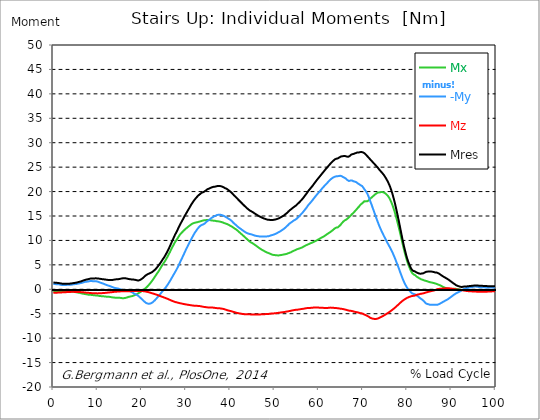
| Category |  Mx |  -My |  Mz |  Mres |
|---|---|---|---|---|
| 0.0 | -0.39 | 1.12 | -0.73 | 1.4 |
| 0.16678370786516855 | -0.39 | 1.08 | -0.73 | 1.37 |
| 0.3335674157303371 | -0.4 | 1.06 | -0.72 | 1.35 |
| 0.5003511235955057 | -0.4 | 1.05 | -0.71 | 1.34 |
| 0.6671348314606742 | -0.39 | 1.05 | -0.7 | 1.33 |
| 0.8339185393258427 | -0.4 | 1.03 | -0.69 | 1.31 |
| 1.0007022471910114 | -0.39 | 1.02 | -0.68 | 1.3 |
| 1.1674859550561796 | -0.37 | 1.01 | -0.67 | 1.28 |
| 1.3342696629213484 | -0.36 | 1 | -0.67 | 1.26 |
| 1.5010533707865168 | -0.35 | 0.97 | -0.66 | 1.24 |
| 1.6678370786516854 | -0.35 | 0.93 | -0.66 | 1.2 |
| 1.8346207865168538 | -0.36 | 0.89 | -0.65 | 1.17 |
| 2.001404494382023 | -0.37 | 0.87 | -0.63 | 1.15 |
| 2.1681882022471908 | -0.37 | 0.86 | -0.62 | 1.14 |
| 2.334971910112359 | -0.38 | 0.86 | -0.61 | 1.13 |
| 2.501755617977528 | -0.38 | 0.86 | -0.6 | 1.13 |
| 2.668539325842697 | -0.37 | 0.87 | -0.59 | 1.12 |
| 2.8353230337078656 | -0.35 | 0.88 | -0.58 | 1.12 |
| 3.0021067415730336 | -0.36 | 0.9 | -0.58 | 1.14 |
| 3.168890449438202 | -0.37 | 0.93 | -0.58 | 1.16 |
| 3.335674157303371 | -0.38 | 0.92 | -0.57 | 1.15 |
| 3.502457865168539 | -0.41 | 0.91 | -0.56 | 1.15 |
| 3.6692415730337076 | -0.43 | 0.9 | -0.55 | 1.15 |
| 3.8360252808988764 | -0.45 | 0.92 | -0.54 | 1.17 |
| 4.002808988764046 | -0.48 | 0.94 | -0.53 | 1.19 |
| 4.169592696629214 | -0.5 | 0.97 | -0.53 | 1.21 |
| 4.3363764044943816 | -0.51 | 0.99 | -0.52 | 1.23 |
| 4.50316011235955 | -0.52 | 1.01 | -0.52 | 1.26 |
| 4.669943820224718 | -0.53 | 1.04 | -0.53 | 1.28 |
| 4.836727528089888 | -0.55 | 1.05 | -0.54 | 1.31 |
| 5.003511235955056 | -0.57 | 1.07 | -0.54 | 1.33 |
| 5.170294943820225 | -0.6 | 1.09 | -0.54 | 1.36 |
| 5.337078651685394 | -0.64 | 1.11 | -0.54 | 1.39 |
| 5.5038623595505625 | -0.69 | 1.13 | -0.54 | 1.43 |
| 5.670646067415731 | -0.7 | 1.17 | -0.54 | 1.48 |
| 5.837429775280899 | -0.72 | 1.21 | -0.55 | 1.51 |
| 6.004213483146067 | -0.75 | 1.24 | -0.57 | 1.55 |
| 6.170997191011236 | -0.78 | 1.26 | -0.58 | 1.59 |
| 6.329002808988764 | -0.82 | 1.29 | -0.59 | 1.64 |
| 6.495786516853932 | -0.87 | 1.33 | -0.6 | 1.7 |
| 6.662570224719101 | -0.9 | 1.38 | -0.61 | 1.76 |
| 6.82935393258427 | -0.93 | 1.43 | -0.62 | 1.82 |
| 6.9961376404494375 | -0.95 | 1.48 | -0.64 | 1.87 |
| 7.162921348314607 | -0.98 | 1.52 | -0.66 | 1.93 |
| 7.329705056179775 | -1 | 1.54 | -0.68 | 1.96 |
| 7.496488764044945 | -1.03 | 1.56 | -0.7 | 1.99 |
| 7.663272471910113 | -1.06 | 1.57 | -0.71 | 2.02 |
| 7.830056179775281 | -1.09 | 1.59 | -0.72 | 2.06 |
| 7.996839887640449 | -1.12 | 1.62 | -0.73 | 2.1 |
| 8.16362359550562 | -1.13 | 1.65 | -0.75 | 2.14 |
| 8.330407303370787 | -1.13 | 1.7 | -0.77 | 2.18 |
| 8.497191011235955 | -1.14 | 1.71 | -0.78 | 2.2 |
| 8.663974719101123 | -1.16 | 1.69 | -0.79 | 2.2 |
| 8.830758426966291 | -1.17 | 1.67 | -0.8 | 2.19 |
| 8.99754213483146 | -1.2 | 1.65 | -0.81 | 2.2 |
| 9.16432584269663 | -1.23 | 1.66 | -0.82 | 2.22 |
| 9.331109550561798 | -1.24 | 1.66 | -0.83 | 2.23 |
| 9.497893258426966 | -1.25 | 1.66 | -0.83 | 2.24 |
| 9.664676966292134 | -1.26 | 1.65 | -0.83 | 2.24 |
| 9.831460674157304 | -1.27 | 1.61 | -0.84 | 2.22 |
| 9.998244382022472 | -1.29 | 1.57 | -0.84 | 2.21 |
| 10.16502808988764 | -1.31 | 1.52 | -0.84 | 2.19 |
| 10.331811797752808 | -1.35 | 1.46 | -0.83 | 2.18 |
| 10.498595505617978 | -1.38 | 1.41 | -0.83 | 2.16 |
| 10.665379213483147 | -1.39 | 1.35 | -0.82 | 2.13 |
| 10.832162921348315 | -1.41 | 1.29 | -0.8 | 2.1 |
| 10.998946629213483 | -1.42 | 1.24 | -0.79 | 2.08 |
| 11.165730337078653 | -1.43 | 1.19 | -0.77 | 2.06 |
| 11.33251404494382 | -1.44 | 1.14 | -0.76 | 2.05 |
| 11.49929775280899 | -1.45 | 1.08 | -0.75 | 2.03 |
| 11.666081460674157 | -1.47 | 1.01 | -0.74 | 2 |
| 11.832865168539326 | -1.49 | 0.95 | -0.73 | 1.98 |
| 11.999648876404493 | -1.51 | 0.89 | -0.71 | 1.96 |
| 12.166432584269662 | -1.53 | 0.84 | -0.69 | 1.94 |
| 12.333216292134832 | -1.54 | 0.78 | -0.67 | 1.92 |
| 12.5 | -1.54 | 0.73 | -0.65 | 1.9 |
| 12.66678370786517 | -1.55 | 0.69 | -0.64 | 1.89 |
| 12.833567415730336 | -1.57 | 0.64 | -0.62 | 1.89 |
| 13.000351123595506 | -1.6 | 0.58 | -0.61 | 1.9 |
| 13.167134831460674 | -1.63 | 0.51 | -0.6 | 1.9 |
| 13.333918539325843 | -1.65 | 0.45 | -0.58 | 1.91 |
| 13.500702247191011 | -1.67 | 0.39 | -0.56 | 1.92 |
| 13.667485955056181 | -1.69 | 0.33 | -0.53 | 1.96 |
| 13.834269662921349 | -1.71 | 0.29 | -0.52 | 2 |
| 14.001053370786519 | -1.72 | 0.25 | -0.5 | 2.02 |
| 14.167837078651687 | -1.72 | 0.21 | -0.49 | 2.03 |
| 14.334620786516853 | -1.73 | 0.2 | -0.48 | 2.05 |
| 14.501404494382026 | -1.73 | 0.18 | -0.48 | 2.06 |
| 14.668188202247192 | -1.73 | 0.14 | -0.47 | 2.06 |
| 14.834971910112362 | -1.73 | 0.08 | -0.45 | 2.09 |
| 15.001755617977528 | -1.74 | 0.03 | -0.44 | 2.12 |
| 15.168539325842698 | -1.76 | -0.02 | -0.43 | 2.15 |
| 15.335323033707864 | -1.79 | -0.06 | -0.42 | 2.19 |
| 15.502106741573034 | -1.81 | -0.1 | -0.4 | 2.22 |
| 15.6688904494382 | -1.83 | -0.14 | -0.39 | 2.24 |
| 15.83567415730337 | -1.82 | -0.15 | -0.39 | 2.24 |
| 16.00245786516854 | -1.81 | -0.15 | -0.38 | 2.25 |
| 16.16924157303371 | -1.8 | -0.15 | -0.38 | 2.26 |
| 16.336025280898877 | -1.76 | -0.16 | -0.39 | 2.24 |
| 16.502808988764045 | -1.72 | -0.17 | -0.39 | 2.21 |
| 16.669592696629216 | -1.67 | -0.19 | -0.39 | 2.18 |
| 16.83637640449438 | -1.61 | -0.21 | -0.4 | 2.14 |
| 17.003160112359552 | -1.56 | -0.24 | -0.4 | 2.11 |
| 17.169943820224717 | -1.52 | -0.3 | -0.4 | 2.08 |
| 17.336727528089888 | -1.49 | -0.38 | -0.39 | 2.05 |
| 17.503511235955056 | -1.47 | -0.47 | -0.38 | 2.04 |
| 17.670294943820224 | -1.43 | -0.55 | -0.38 | 2.02 |
| 17.837078651685395 | -1.39 | -0.63 | -0.37 | 2.01 |
| 18.003862359550563 | -1.35 | -0.72 | -0.36 | 2 |
| 18.17064606741573 | -1.29 | -0.83 | -0.35 | 1.98 |
| 18.3374297752809 | -1.22 | -0.93 | -0.34 | 1.96 |
| 18.504213483146067 | -1.15 | -1.01 | -0.34 | 1.96 |
| 18.662219101123597 | -1.09 | -1.05 | -0.34 | 1.9 |
| 18.829002808988765 | -1.02 | -1.12 | -0.34 | 1.84 |
| 18.995786516853933 | -0.94 | -1.21 | -0.34 | 1.82 |
| 19.1625702247191 | -0.84 | -1.32 | -0.33 | 1.8 |
| 19.32935393258427 | -0.75 | -1.45 | -0.33 | 1.82 |
| 19.49613764044944 | -0.67 | -1.61 | -0.33 | 1.88 |
| 19.662921348314608 | -0.57 | -1.73 | -0.33 | 1.94 |
| 19.829705056179776 | -0.47 | -1.88 | -0.34 | 2.04 |
| 19.996488764044944 | -0.37 | -2.01 | -0.35 | 2.13 |
| 20.163272471910112 | -0.27 | -2.14 | -0.36 | 2.23 |
| 20.33005617977528 | -0.16 | -2.3 | -0.38 | 2.37 |
| 20.49683988764045 | -0.04 | -2.44 | -0.4 | 2.51 |
| 20.663623595505616 | 0.09 | -2.58 | -0.43 | 2.66 |
| 20.830407303370787 | 0.21 | -2.71 | -0.45 | 2.79 |
| 20.997191011235955 | 0.34 | -2.82 | -0.48 | 2.92 |
| 21.163974719101123 | 0.49 | -2.88 | -0.52 | 3 |
| 21.330758426966295 | 0.64 | -2.93 | -0.55 | 3.09 |
| 21.497542134831463 | 0.8 | -2.96 | -0.59 | 3.16 |
| 21.66432584269663 | 0.98 | -2.96 | -0.63 | 3.23 |
| 21.8311095505618 | 1.17 | -2.93 | -0.67 | 3.3 |
| 21.997893258426966 | 1.35 | -2.89 | -0.72 | 3.36 |
| 22.164676966292134 | 1.54 | -2.84 | -0.77 | 3.43 |
| 22.331460674157306 | 1.74 | -2.74 | -0.82 | 3.53 |
| 22.498244382022467 | 1.96 | -2.61 | -0.87 | 3.64 |
| 22.66502808988764 | 2.18 | -2.49 | -0.91 | 3.76 |
| 22.831811797752806 | 2.41 | -2.35 | -0.96 | 3.89 |
| 22.99859550561798 | 2.63 | -2.2 | -1.01 | 4.03 |
| 23.165379213483146 | 2.86 | -2.04 | -1.06 | 4.18 |
| 23.332162921348313 | 3.09 | -1.86 | -1.11 | 4.35 |
| 23.49894662921348 | 3.3 | -1.69 | -1.16 | 4.54 |
| 23.665730337078653 | 3.5 | -1.5 | -1.21 | 4.74 |
| 23.83251404494382 | 3.74 | -1.31 | -1.27 | 4.95 |
| 23.999297752808985 | 3.99 | -1.15 | -1.33 | 5.13 |
| 24.166081460674157 | 4.25 | -0.98 | -1.39 | 5.33 |
| 24.332865168539325 | 4.5 | -0.79 | -1.45 | 5.56 |
| 24.499648876404496 | 4.75 | -0.59 | -1.5 | 5.79 |
| 24.666432584269664 | 5 | -0.39 | -1.56 | 6.04 |
| 24.833216292134832 | 5.22 | -0.23 | -1.61 | 6.26 |
| 25.0 | 5.42 | -0.09 | -1.67 | 6.47 |
| 25.16678370786517 | 5.66 | 0.09 | -1.72 | 6.72 |
| 25.33356741573034 | 5.91 | 0.29 | -1.78 | 6.99 |
| 25.500351123595504 | 6.17 | 0.49 | -1.84 | 7.26 |
| 25.66713483146067 | 6.44 | 0.71 | -1.9 | 7.54 |
| 25.833918539325843 | 6.71 | 0.93 | -1.96 | 7.84 |
| 26.00070224719101 | 7 | 1.16 | -2.03 | 8.14 |
| 26.16748595505618 | 7.29 | 1.4 | -2.09 | 8.45 |
| 26.334269662921347 | 7.58 | 1.65 | -2.16 | 8.77 |
| 26.50105337078652 | 7.89 | 1.9 | -2.23 | 9.11 |
| 26.667837078651687 | 8.2 | 2.17 | -2.3 | 9.45 |
| 26.834620786516858 | 8.51 | 2.42 | -2.37 | 9.79 |
| 27.001404494382022 | 8.79 | 2.69 | -2.42 | 10.13 |
| 27.16818820224719 | 9.08 | 2.96 | -2.48 | 10.47 |
| 27.334971910112362 | 9.36 | 3.22 | -2.54 | 10.81 |
| 27.50175561797753 | 9.64 | 3.48 | -2.59 | 11.14 |
| 27.668539325842698 | 9.87 | 3.75 | -2.63 | 11.43 |
| 27.835323033707866 | 10.08 | 4.01 | -2.66 | 11.71 |
| 28.002106741573037 | 10.31 | 4.31 | -2.7 | 12.02 |
| 28.168890449438205 | 10.55 | 4.6 | -2.74 | 12.34 |
| 28.335674157303373 | 10.79 | 4.9 | -2.79 | 12.67 |
| 28.502457865168537 | 11.02 | 5.24 | -2.82 | 12.99 |
| 28.669241573033705 | 11.23 | 5.57 | -2.86 | 13.28 |
| 28.836025280898877 | 11.4 | 5.89 | -2.89 | 13.55 |
| 29.002808988764052 | 11.57 | 6.2 | -2.92 | 13.84 |
| 29.169592696629213 | 11.73 | 6.52 | -2.95 | 14.11 |
| 29.336376404494384 | 11.88 | 6.85 | -2.98 | 14.39 |
| 29.50316011235955 | 12.04 | 7.17 | -3.01 | 14.7 |
| 29.669943820224724 | 12.18 | 7.5 | -3.05 | 14.98 |
| 29.836727528089884 | 12.31 | 7.83 | -3.08 | 15.23 |
| 30.003511235955056 | 12.44 | 8.15 | -3.1 | 15.49 |
| 30.170294943820224 | 12.57 | 8.45 | -3.13 | 15.75 |
| 30.337078651685395 | 12.69 | 8.74 | -3.16 | 16.02 |
| 30.503862359550563 | 12.82 | 9.05 | -3.18 | 16.27 |
| 30.670646067415728 | 12.94 | 9.35 | -3.2 | 16.52 |
| 30.837429775280903 | 13.06 | 9.66 | -3.23 | 16.79 |
| 30.99543539325843 | 13.17 | 9.95 | -3.25 | 17.05 |
| 31.162219101123597 | 13.28 | 10.25 | -3.28 | 17.32 |
| 31.32900280898876 | 13.38 | 10.53 | -3.3 | 17.56 |
| 31.495786516853936 | 13.46 | 10.79 | -3.32 | 17.78 |
| 31.6625702247191 | 13.53 | 11.07 | -3.34 | 18.01 |
| 31.82935393258427 | 13.58 | 11.35 | -3.36 | 18.22 |
| 31.996137640449433 | 13.62 | 11.6 | -3.37 | 18.42 |
| 32.162921348314605 | 13.66 | 11.8 | -3.37 | 18.59 |
| 32.329705056179776 | 13.69 | 12.02 | -3.38 | 18.76 |
| 32.49648876404494 | 13.72 | 12.25 | -3.39 | 18.94 |
| 32.66327247191011 | 13.76 | 12.46 | -3.4 | 19.1 |
| 32.83005617977528 | 13.81 | 12.62 | -3.42 | 19.25 |
| 32.996839887640455 | 13.85 | 12.8 | -3.43 | 19.38 |
| 33.16362359550562 | 13.88 | 12.93 | -3.45 | 19.49 |
| 33.330407303370784 | 13.93 | 13.07 | -3.47 | 19.62 |
| 33.497191011235955 | 13.99 | 13.19 | -3.5 | 19.75 |
| 33.66397471910113 | 14.03 | 13.21 | -3.54 | 19.8 |
| 33.83075842696629 | 14.08 | 13.24 | -3.58 | 19.86 |
| 33.997542134831455 | 14.11 | 13.33 | -3.6 | 19.96 |
| 34.164325842696634 | 14.11 | 13.42 | -3.62 | 20.02 |
| 34.3311095505618 | 14.14 | 13.55 | -3.64 | 20.12 |
| 34.49789325842697 | 14.17 | 13.69 | -3.66 | 20.24 |
| 34.66467696629213 | 14.18 | 13.85 | -3.68 | 20.36 |
| 34.831460674157306 | 14.17 | 14.02 | -3.69 | 20.47 |
| 34.99824438202247 | 14.17 | 14.07 | -3.72 | 20.51 |
| 35.16502808988764 | 14.17 | 14.2 | -3.73 | 20.6 |
| 35.331811797752806 | 14.16 | 14.28 | -3.74 | 20.65 |
| 35.49859550561798 | 14.13 | 14.44 | -3.72 | 20.74 |
| 35.66537921348315 | 14.11 | 14.56 | -3.72 | 20.81 |
| 35.83216292134831 | 14.08 | 14.67 | -3.73 | 20.87 |
| 35.998946629213485 | 14.07 | 14.73 | -3.74 | 20.9 |
| 36.16573033707865 | 14.04 | 14.88 | -3.75 | 20.96 |
| 36.33251404494382 | 14.02 | 14.93 | -3.78 | 20.98 |
| 36.499297752808985 | 14.01 | 14.98 | -3.81 | 21 |
| 36.666081460674164 | 14 | 15.04 | -3.83 | 21.03 |
| 36.83286516853932 | 13.97 | 15.11 | -3.84 | 21.07 |
| 36.99964887640449 | 13.92 | 15.2 | -3.86 | 21.11 |
| 37.166432584269664 | 13.92 | 15.24 | -3.87 | 21.14 |
| 37.333216292134836 | 13.9 | 15.26 | -3.89 | 21.15 |
| 37.5 | 13.87 | 15.26 | -3.89 | 21.14 |
| 37.666783707865164 | 13.84 | 15.27 | -3.9 | 21.14 |
| 37.833567415730336 | 13.81 | 15.24 | -3.92 | 21.11 |
| 38.00035112359551 | 13.77 | 15.21 | -3.95 | 21.07 |
| 38.16713483146068 | 13.73 | 15.15 | -3.97 | 21.01 |
| 38.333918539325836 | 13.67 | 15.1 | -4 | 20.95 |
| 38.50070224719101 | 13.6 | 15.05 | -4.04 | 20.88 |
| 38.66748595505618 | 13.54 | 14.96 | -4.08 | 20.79 |
| 38.83426966292135 | 13.48 | 14.88 | -4.13 | 20.7 |
| 39.001053370786515 | 13.44 | 14.79 | -4.18 | 20.63 |
| 39.16783707865169 | 13.4 | 14.71 | -4.23 | 20.57 |
| 39.33462078651686 | 13.33 | 14.61 | -4.29 | 20.46 |
| 39.50140449438202 | 13.26 | 14.51 | -4.33 | 20.35 |
| 39.668188202247194 | 13.18 | 14.41 | -4.36 | 20.24 |
| 39.83497191011236 | 13.09 | 14.32 | -4.4 | 20.12 |
| 40.00175561797753 | 13 | 14.23 | -4.44 | 20.01 |
| 40.168539325842694 | 12.91 | 14.12 | -4.47 | 19.88 |
| 40.335323033707866 | 12.84 | 13.97 | -4.52 | 19.74 |
| 40.50210674157304 | 12.75 | 13.81 | -4.57 | 19.58 |
| 40.6688904494382 | 12.64 | 13.65 | -4.61 | 19.41 |
| 40.83567415730337 | 12.53 | 13.49 | -4.65 | 19.23 |
| 41.00245786516854 | 12.43 | 13.36 | -4.7 | 19.09 |
| 41.16924157303371 | 12.35 | 13.25 | -4.74 | 18.97 |
| 41.33602528089887 | 12.25 | 13.12 | -4.79 | 18.82 |
| 41.502808988764045 | 12.12 | 12.99 | -4.83 | 18.66 |
| 41.669592696629216 | 11.99 | 12.83 | -4.86 | 18.48 |
| 41.83637640449439 | 11.86 | 12.7 | -4.9 | 18.32 |
| 42.00316011235955 | 11.72 | 12.59 | -4.93 | 18.17 |
| 42.16994382022472 | 11.59 | 12.49 | -4.95 | 18.02 |
| 42.33672752808989 | 11.45 | 12.39 | -4.98 | 17.87 |
| 42.50351123595506 | 11.32 | 12.27 | -5.01 | 17.72 |
| 42.670294943820224 | 11.19 | 12.15 | -5.03 | 17.57 |
| 42.83707865168539 | 11.07 | 12.01 | -5.06 | 17.41 |
| 43.00386235955057 | 10.92 | 11.94 | -5.08 | 17.27 |
| 43.17064606741573 | 10.78 | 11.83 | -5.09 | 17.12 |
| 43.32865168539326 | 10.65 | 11.73 | -5.1 | 16.97 |
| 43.495435393258425 | 10.51 | 11.65 | -5.11 | 16.83 |
| 43.6622191011236 | 10.37 | 11.55 | -5.12 | 16.68 |
| 43.82900280898876 | 10.23 | 11.49 | -5.12 | 16.55 |
| 43.99578651685393 | 10.09 | 11.43 | -5.13 | 16.43 |
| 44.162570224719104 | 9.96 | 11.38 | -5.13 | 16.3 |
| 44.32935393258427 | 9.82 | 11.33 | -5.13 | 16.19 |
| 44.49613764044944 | 9.7 | 11.29 | -5.14 | 16.08 |
| 44.66292134831461 | 9.59 | 11.27 | -5.14 | 16 |
| 44.82970505617978 | 9.53 | 11.21 | -5.15 | 15.92 |
| 44.99648876404493 | 9.45 | 11.17 | -5.15 | 15.84 |
| 45.16327247191011 | 9.35 | 11.11 | -5.15 | 15.74 |
| 45.33005617977528 | 9.24 | 11.06 | -5.16 | 15.63 |
| 45.49683988764045 | 9.14 | 11 | -5.16 | 15.53 |
| 45.66362359550561 | 9.03 | 10.96 | -5.17 | 15.43 |
| 45.83040730337079 | 8.92 | 10.92 | -5.17 | 15.34 |
| 45.99719101123596 | 8.81 | 10.9 | -5.17 | 15.25 |
| 46.16397471910113 | 8.69 | 10.87 | -5.17 | 15.15 |
| 46.33075842696629 | 8.58 | 10.86 | -5.16 | 15.06 |
| 46.497542134831455 | 8.48 | 10.83 | -5.16 | 14.97 |
| 46.66432584269663 | 8.37 | 10.81 | -5.15 | 14.89 |
| 46.83110955056179 | 8.27 | 10.8 | -5.14 | 14.82 |
| 46.99789325842696 | 8.17 | 10.81 | -5.13 | 14.74 |
| 47.164676966292134 | 8.08 | 10.8 | -5.12 | 14.67 |
| 47.331460674157306 | 7.99 | 10.8 | -5.11 | 14.6 |
| 47.49824438202247 | 7.91 | 10.8 | -5.11 | 14.54 |
| 47.66502808988764 | 7.83 | 10.8 | -5.1 | 14.48 |
| 47.83181179775281 | 7.76 | 10.8 | -5.09 | 14.42 |
| 47.99859550561797 | 7.67 | 10.81 | -5.08 | 14.37 |
| 48.16537921348314 | 7.59 | 10.83 | -5.07 | 14.32 |
| 48.33216292134831 | 7.52 | 10.83 | -5.06 | 14.28 |
| 48.498946629213485 | 7.46 | 10.83 | -5.05 | 14.23 |
| 48.66573033707865 | 7.4 | 10.86 | -5.04 | 14.21 |
| 48.83251404494382 | 7.35 | 10.9 | -5.02 | 14.21 |
| 48.99929775280899 | 7.28 | 10.97 | -4.99 | 14.21 |
| 49.166081460674164 | 7.22 | 11.01 | -4.98 | 14.19 |
| 49.33286516853933 | 7.13 | 11.07 | -4.97 | 14.18 |
| 49.499648876404486 | 7.07 | 11.1 | -4.96 | 14.17 |
| 49.666432584269664 | 7.05 | 11.15 | -4.95 | 14.19 |
| 49.83321629213483 | 7.02 | 11.21 | -4.94 | 14.22 |
| 50.0 | 7 | 11.26 | -4.92 | 14.25 |
| 50.166783707865164 | 6.99 | 11.32 | -4.91 | 14.28 |
| 50.33356741573034 | 6.98 | 11.38 | -4.89 | 14.31 |
| 50.50035112359551 | 6.96 | 11.46 | -4.88 | 14.36 |
| 50.66713483146068 | 6.94 | 11.55 | -4.85 | 14.42 |
| 50.83391853932584 | 6.94 | 11.63 | -4.83 | 14.47 |
| 51.00070224719101 | 6.94 | 11.72 | -4.8 | 14.54 |
| 51.16748595505618 | 6.96 | 11.8 | -4.78 | 14.61 |
| 51.33426966292134 | 6.99 | 11.88 | -4.76 | 14.68 |
| 51.50105337078652 | 7.02 | 11.99 | -4.74 | 14.78 |
| 51.66783707865169 | 7.04 | 12.09 | -4.72 | 14.87 |
| 51.83462078651686 | 7.06 | 12.2 | -4.7 | 14.96 |
| 52.00140449438202 | 7.1 | 12.29 | -4.68 | 15.04 |
| 52.168188202247194 | 7.13 | 12.38 | -4.65 | 15.13 |
| 52.33497191011236 | 7.16 | 12.53 | -4.63 | 15.26 |
| 52.50175561797752 | 7.18 | 12.69 | -4.6 | 15.39 |
| 52.668539325842694 | 7.22 | 12.81 | -4.57 | 15.51 |
| 52.835323033707866 | 7.28 | 12.92 | -4.55 | 15.63 |
| 53.00210674157304 | 7.34 | 13.08 | -4.52 | 15.78 |
| 53.1688904494382 | 7.39 | 13.25 | -4.49 | 15.94 |
| 53.33567415730337 | 7.45 | 13.4 | -4.46 | 16.08 |
| 53.502457865168545 | 7.5 | 13.52 | -4.44 | 16.21 |
| 53.669241573033716 | 7.56 | 13.63 | -4.41 | 16.33 |
| 53.83602528089887 | 7.64 | 13.72 | -4.38 | 16.44 |
| 54.002808988764045 | 7.72 | 13.83 | -4.33 | 16.56 |
| 54.169592696629216 | 7.8 | 13.95 | -4.28 | 16.69 |
| 54.33637640449438 | 7.87 | 14.07 | -4.27 | 16.82 |
| 54.50316011235955 | 7.93 | 14.15 | -4.24 | 16.92 |
| 54.669943820224724 | 8.01 | 14.22 | -4.22 | 17.01 |
| 54.836727528089895 | 8.08 | 14.32 | -4.2 | 17.13 |
| 55.00351123595506 | 8.16 | 14.43 | -4.19 | 17.26 |
| 55.17029494382022 | 8.22 | 14.59 | -4.18 | 17.43 |
| 55.337078651685395 | 8.27 | 14.73 | -4.16 | 17.57 |
| 55.50386235955056 | 8.32 | 14.87 | -4.14 | 17.7 |
| 55.66186797752809 | 8.36 | 15.02 | -4.11 | 17.85 |
| 55.82865168539326 | 8.41 | 15.19 | -4.08 | 18.01 |
| 55.995435393258425 | 8.47 | 15.36 | -4.05 | 18.17 |
| 56.1622191011236 | 8.54 | 15.52 | -4.03 | 18.34 |
| 56.32900280898877 | 8.61 | 15.67 | -4.01 | 18.5 |
| 56.49578651685393 | 8.7 | 15.86 | -3.99 | 18.69 |
| 56.6625702247191 | 8.78 | 16.05 | -3.97 | 18.9 |
| 56.82935393258427 | 8.86 | 16.24 | -3.94 | 19.1 |
| 56.99613764044943 | 8.95 | 16.43 | -3.9 | 19.3 |
| 57.16292134831461 | 9.03 | 16.62 | -3.88 | 19.5 |
| 57.329705056179776 | 9.09 | 16.82 | -3.85 | 19.7 |
| 57.49648876404495 | 9.16 | 17.05 | -3.84 | 19.93 |
| 57.66327247191011 | 9.22 | 17.26 | -3.83 | 20.15 |
| 57.83005617977529 | 9.28 | 17.43 | -3.83 | 20.32 |
| 57.99683988764044 | 9.36 | 17.6 | -3.82 | 20.51 |
| 58.16362359550561 | 9.42 | 17.78 | -3.81 | 20.69 |
| 58.33040730337079 | 9.49 | 17.95 | -3.79 | 20.87 |
| 58.497191011235955 | 9.55 | 18.13 | -3.78 | 21.06 |
| 58.66397471910112 | 9.61 | 18.32 | -3.76 | 21.25 |
| 58.83075842696629 | 9.68 | 18.53 | -3.74 | 21.46 |
| 58.99754213483147 | 9.75 | 18.72 | -3.73 | 21.66 |
| 59.164325842696634 | 9.82 | 18.91 | -3.72 | 21.86 |
| 59.33110955056179 | 9.9 | 19.11 | -3.72 | 22.07 |
| 59.49789325842697 | 9.99 | 19.28 | -3.73 | 22.25 |
| 59.664676966292134 | 10.07 | 19.48 | -3.73 | 22.47 |
| 59.8314606741573 | 10.16 | 19.65 | -3.74 | 22.65 |
| 59.99824438202247 | 10.24 | 19.81 | -3.75 | 22.83 |
| 60.16502808988765 | 10.33 | 19.98 | -3.77 | 23.01 |
| 60.33181179775281 | 10.42 | 20.16 | -3.78 | 23.2 |
| 60.49859550561798 | 10.51 | 20.34 | -3.79 | 23.39 |
| 60.66537921348315 | 10.59 | 20.51 | -3.8 | 23.58 |
| 60.83216292134831 | 10.66 | 20.71 | -3.8 | 23.77 |
| 60.99894662921348 | 10.74 | 20.88 | -3.8 | 23.95 |
| 61.16573033707864 | 10.83 | 21.04 | -3.81 | 24.13 |
| 61.33251404494383 | 10.93 | 21.21 | -3.82 | 24.32 |
| 61.49929775280899 | 11.04 | 21.37 | -3.82 | 24.51 |
| 61.66608146067416 | 11.14 | 21.52 | -3.83 | 24.69 |
| 61.83286516853932 | 11.25 | 21.66 | -3.84 | 24.86 |
| 61.99964887640451 | 11.35 | 21.83 | -3.83 | 25.03 |
| 62.16643258426967 | 11.44 | 22.01 | -3.8 | 25.22 |
| 62.33321629213482 | 11.55 | 22.18 | -3.77 | 25.4 |
| 62.5 | 11.65 | 22.33 | -3.76 | 25.57 |
| 62.66678370786517 | 11.74 | 22.47 | -3.75 | 25.73 |
| 62.833567415730336 | 11.85 | 22.6 | -3.76 | 25.89 |
| 63.0003511235955 | 11.98 | 22.72 | -3.77 | 26.06 |
| 63.16713483146068 | 12.12 | 22.82 | -3.8 | 26.22 |
| 63.33391853932585 | 12.22 | 22.9 | -3.8 | 26.34 |
| 63.500702247191015 | 12.36 | 22.99 | -3.81 | 26.49 |
| 63.66748595505618 | 12.49 | 23.06 | -3.82 | 26.6 |
| 63.83426966292135 | 12.6 | 23.1 | -3.83 | 26.7 |
| 64.00105337078651 | 12.63 | 23.12 | -3.85 | 26.74 |
| 64.16783707865169 | 12.64 | 23.13 | -3.86 | 26.75 |
| 64.33462078651687 | 12.68 | 23.15 | -3.88 | 26.79 |
| 64.50140449438203 | 12.79 | 23.17 | -3.91 | 26.87 |
| 64.6681882022472 | 12.95 | 23.21 | -3.93 | 26.99 |
| 64.83497191011236 | 13.1 | 23.24 | -3.95 | 27.09 |
| 65.00175561797754 | 13.25 | 23.25 | -3.98 | 27.17 |
| 65.16853932584269 | 13.47 | 23.17 | -3.99 | 27.21 |
| 65.33532303370787 | 13.66 | 23.07 | -4.02 | 27.23 |
| 65.50210674157304 | 13.81 | 22.97 | -4.05 | 27.23 |
| 65.66889044943821 | 13.97 | 22.9 | -4.08 | 27.27 |
| 65.83567415730337 | 14.09 | 22.84 | -4.11 | 27.3 |
| 66.00245786516854 | 14.15 | 22.74 | -4.15 | 27.26 |
| 66.1692415730337 | 14.22 | 22.63 | -4.19 | 27.22 |
| 66.33602528089888 | 14.32 | 22.48 | -4.24 | 27.17 |
| 66.50280898876404 | 14.47 | 22.34 | -4.28 | 27.15 |
| 66.66959269662921 | 14.6 | 22.19 | -4.32 | 27.12 |
| 66.83637640449439 | 14.73 | 22.17 | -4.36 | 27.19 |
| 67.00316011235955 | 14.84 | 22.2 | -4.39 | 27.27 |
| 67.16994382022472 | 15.03 | 22.25 | -4.41 | 27.42 |
| 67.33672752808988 | 15.23 | 22.29 | -4.42 | 27.57 |
| 67.50351123595506 | 15.37 | 22.28 | -4.45 | 27.64 |
| 67.67029494382022 | 15.5 | 22.19 | -4.48 | 27.66 |
| 67.83707865168539 | 15.63 | 22.11 | -4.53 | 27.68 |
| 67.99508426966291 | 15.79 | 22.08 | -4.58 | 27.75 |
| 68.16186797752809 | 15.97 | 22.04 | -4.62 | 27.82 |
| 68.32865168539327 | 16.13 | 21.97 | -4.65 | 27.87 |
| 68.49543539325843 | 16.3 | 21.92 | -4.67 | 27.92 |
| 68.6622191011236 | 16.49 | 21.84 | -4.69 | 27.98 |
| 68.82900280898876 | 16.67 | 21.67 | -4.74 | 27.97 |
| 68.99578651685394 | 16.83 | 21.56 | -4.78 | 27.99 |
| 69.1625702247191 | 16.98 | 21.5 | -4.81 | 28.03 |
| 69.32935393258425 | 17.21 | 21.39 | -4.87 | 28.07 |
| 69.49613764044945 | 17.4 | 21.28 | -4.9 | 28.1 |
| 69.66292134831461 | 17.48 | 21.2 | -4.91 | 28.09 |
| 69.82970505617978 | 17.56 | 21.12 | -4.93 | 28.07 |
| 69.99648876404494 | 17.73 | 20.92 | -5.01 | 28.02 |
| 70.16327247191012 | 17.93 | 20.68 | -5.11 | 27.95 |
| 70.33005617977528 | 18.03 | 20.46 | -5.18 | 27.86 |
| 70.49683988764045 | 18.05 | 20.26 | -5.25 | 27.73 |
| 70.66362359550561 | 17.99 | 20.07 | -5.3 | 27.56 |
| 70.83040730337079 | 17.98 | 19.82 | -5.37 | 27.39 |
| 70.99719101123596 | 18.02 | 19.54 | -5.45 | 27.23 |
| 71.16397471910112 | 18.11 | 19.22 | -5.54 | 27.07 |
| 71.3307584269663 | 18.24 | 18.84 | -5.63 | 26.91 |
| 71.49754213483146 | 18.4 | 18.41 | -5.74 | 26.72 |
| 71.66432584269663 | 18.55 | 17.99 | -5.84 | 26.55 |
| 71.83110955056179 | 18.68 | 17.59 | -5.9 | 26.39 |
| 71.99789325842697 | 18.82 | 17.2 | -5.95 | 26.24 |
| 72.16467696629215 | 18.94 | 16.75 | -6.01 | 26.05 |
| 72.3314606741573 | 19.09 | 16.34 | -6.04 | 25.9 |
| 72.49824438202248 | 19.22 | 15.92 | -6.06 | 25.75 |
| 72.66502808988764 | 19.35 | 15.49 | -6.07 | 25.58 |
| 72.8318117977528 | 19.47 | 15.05 | -6.07 | 25.41 |
| 72.99859550561797 | 19.59 | 14.63 | -6.06 | 25.25 |
| 73.16537921348315 | 19.69 | 14.21 | -6.03 | 25.09 |
| 73.33216292134833 | 19.78 | 13.81 | -5.99 | 24.92 |
| 73.49894662921349 | 19.81 | 13.42 | -5.93 | 24.72 |
| 73.66573033707864 | 19.83 | 13.04 | -5.87 | 24.52 |
| 73.83251404494382 | 19.86 | 12.67 | -5.8 | 24.34 |
| 73.99929775280899 | 19.88 | 12.33 | -5.72 | 24.17 |
| 74.16608146067415 | 19.9 | 12 | -5.65 | 24.01 |
| 74.33286516853933 | 19.91 | 11.67 | -5.57 | 23.84 |
| 74.49964887640449 | 19.89 | 11.37 | -5.48 | 23.68 |
| 74.66643258426967 | 19.83 | 11.05 | -5.4 | 23.47 |
| 74.83321629213484 | 19.76 | 10.75 | -5.31 | 23.24 |
| 75.0 | 19.66 | 10.45 | -5.22 | 23.02 |
| 75.16678370786516 | 19.55 | 10.17 | -5.12 | 22.78 |
| 75.33356741573033 | 19.41 | 9.87 | -5.03 | 22.52 |
| 75.5003511235955 | 19.26 | 9.58 | -4.94 | 22.24 |
| 75.66713483146067 | 19.07 | 9.29 | -4.84 | 21.94 |
| 75.83391853932585 | 18.85 | 9.01 | -4.73 | 21.62 |
| 76.00070224719101 | 18.61 | 8.74 | -4.63 | 21.28 |
| 76.16748595505618 | 18.32 | 8.46 | -4.52 | 20.9 |
| 76.33426966292136 | 17.99 | 8.18 | -4.41 | 20.47 |
| 76.50105337078652 | 17.64 | 7.87 | -4.31 | 20.01 |
| 76.66783707865167 | 17.25 | 7.55 | -4.19 | 19.52 |
| 76.83462078651685 | 16.82 | 7.22 | -4.07 | 18.99 |
| 77.00140449438202 | 16.35 | 6.86 | -3.94 | 18.42 |
| 77.1681882022472 | 15.88 | 6.49 | -3.82 | 17.83 |
| 77.33497191011236 | 15.35 | 6.12 | -3.69 | 17.19 |
| 77.50175561797754 | 14.79 | 5.72 | -3.55 | 16.52 |
| 77.6685393258427 | 14.22 | 5.34 | -3.41 | 15.84 |
| 77.83532303370787 | 13.64 | 4.94 | -3.28 | 15.15 |
| 78.00210674157303 | 13.03 | 4.55 | -3.14 | 14.43 |
| 78.1688904494382 | 12.41 | 4.16 | -2.99 | 13.71 |
| 78.33567415730337 | 11.78 | 3.72 | -2.85 | 12.96 |
| 78.50245786516854 | 11.13 | 3.3 | -2.72 | 12.2 |
| 78.66924157303372 | 10.47 | 2.91 | -2.58 | 11.45 |
| 78.83602528089888 | 9.82 | 2.51 | -2.46 | 10.7 |
| 79.00280898876404 | 9.17 | 2.1 | -2.33 | 9.96 |
| 79.16959269662921 | 8.54 | 1.75 | -2.22 | 9.26 |
| 79.33637640449439 | 7.92 | 1.42 | -2.11 | 8.59 |
| 79.50316011235955 | 7.34 | 1.11 | -2.01 | 7.97 |
| 79.66994382022472 | 6.78 | 0.82 | -1.92 | 7.38 |
| 79.8367275280899 | 6.24 | 0.55 | -1.83 | 6.81 |
| 80.00351123595506 | 5.73 | 0.3 | -1.75 | 6.29 |
| 80.17029494382022 | 5.28 | 0.08 | -1.67 | 5.82 |
| 80.32830056179776 | 4.88 | -0.08 | -1.61 | 5.42 |
| 80.49508426966293 | 4.5 | -0.24 | -1.55 | 5.05 |
| 80.66186797752809 | 4.13 | -0.43 | -1.5 | 4.68 |
| 80.82865168539325 | 3.79 | -0.61 | -1.45 | 4.35 |
| 80.99543539325842 | 3.51 | -0.74 | -1.4 | 4.1 |
| 81.1622191011236 | 3.28 | -0.86 | -1.37 | 3.9 |
| 81.32900280898878 | 3.11 | -0.93 | -1.35 | 3.77 |
| 81.49578651685394 | 3.03 | -0.96 | -1.34 | 3.73 |
| 81.6625702247191 | 2.97 | -0.99 | -1.3 | 3.7 |
| 81.82935393258427 | 2.87 | -1.06 | -1.24 | 3.63 |
| 81.99613764044945 | 2.72 | -1.17 | -1.19 | 3.52 |
| 82.16292134831461 | 2.58 | -1.27 | -1.14 | 3.44 |
| 82.32970505617978 | 2.48 | -1.37 | -1.09 | 3.36 |
| 82.49648876404494 | 2.39 | -1.49 | -1.06 | 3.28 |
| 82.66327247191012 | 2.3 | -1.62 | -1.02 | 3.24 |
| 82.83005617977528 | 2.21 | -1.75 | -0.98 | 3.21 |
| 82.99683988764045 | 2.11 | -1.87 | -0.94 | 3.18 |
| 83.16362359550563 | 2.04 | -1.97 | -0.92 | 3.18 |
| 83.33040730337079 | 2.01 | -2.08 | -0.89 | 3.23 |
| 83.49719101123596 | 1.95 | -2.2 | -0.86 | 3.27 |
| 83.66397471910112 | 1.89 | -2.32 | -0.83 | 3.28 |
| 83.8307584269663 | 1.82 | -2.48 | -0.79 | 3.34 |
| 83.99754213483146 | 1.78 | -2.66 | -0.73 | 3.44 |
| 84.16432584269663 | 1.74 | -2.83 | -0.68 | 3.54 |
| 84.33110955056179 | 1.7 | -2.94 | -0.64 | 3.59 |
| 84.49789325842697 | 1.65 | -3 | -0.59 | 3.62 |
| 84.66467696629213 | 1.58 | -3.04 | -0.55 | 3.62 |
| 84.8314606741573 | 1.54 | -3.07 | -0.51 | 3.62 |
| 84.99824438202248 | 1.49 | -3.13 | -0.47 | 3.64 |
| 85.16502808988764 | 1.45 | -3.18 | -0.43 | 3.65 |
| 85.3318117977528 | 1.42 | -3.19 | -0.39 | 3.64 |
| 85.49859550561797 | 1.39 | -3.19 | -0.37 | 3.61 |
| 85.66537921348315 | 1.36 | -3.2 | -0.32 | 3.6 |
| 85.83216292134831 | 1.32 | -3.19 | -0.28 | 3.58 |
| 85.99894662921348 | 1.29 | -3.17 | -0.26 | 3.53 |
| 86.16573033707866 | 1.24 | -3.15 | -0.21 | 3.49 |
| 86.33251404494384 | 1.19 | -3.14 | -0.17 | 3.45 |
| 86.499297752809 | 1.15 | -3.15 | -0.11 | 3.43 |
| 86.66608146067415 | 1.09 | -3.19 | -0.04 | 3.43 |
| 86.83286516853933 | 1.03 | -3.17 | 0.02 | 3.37 |
| 86.99964887640449 | 0.97 | -3.13 | 0.06 | 3.31 |
| 87.16643258426966 | 0.92 | -3.05 | 0.07 | 3.21 |
| 87.33321629213482 | 0.86 | -2.97 | 0.09 | 3.12 |
| 87.5 | 0.79 | -2.89 | 0.11 | 3.02 |
| 87.66678370786518 | 0.71 | -2.8 | 0.13 | 2.91 |
| 87.83356741573033 | 0.63 | -2.72 | 0.14 | 2.81 |
| 88.00035112359551 | 0.56 | -2.62 | 0.14 | 2.71 |
| 88.16713483146067 | 0.47 | -2.55 | 0.15 | 2.62 |
| 88.33391853932584 | 0.41 | -2.45 | 0.16 | 2.51 |
| 88.500702247191 | 0.33 | -2.38 | 0.17 | 2.43 |
| 88.66748595505618 | 0.27 | -2.31 | 0.19 | 2.35 |
| 88.83426966292136 | 0.21 | -2.23 | 0.2 | 2.27 |
| 89.00105337078652 | 0.17 | -2.14 | 0.21 | 2.17 |
| 89.16783707865169 | 0.12 | -2.05 | 0.21 | 2.08 |
| 89.33462078651687 | 0.08 | -1.95 | 0.21 | 1.98 |
| 89.50140449438203 | 0.05 | -1.84 | 0.2 | 1.86 |
| 89.6681882022472 | 0.04 | -1.73 | 0.18 | 1.76 |
| 89.83497191011236 | 0.04 | -1.62 | 0.16 | 1.64 |
| 90.00175561797754 | 0.06 | -1.51 | 0.14 | 1.53 |
| 90.16853932584269 | 0.07 | -1.39 | 0.12 | 1.41 |
| 90.33532303370787 | 0.08 | -1.28 | 0.1 | 1.3 |
| 90.50210674157303 | 0.09 | -1.17 | 0.07 | 1.2 |
| 90.6688904494382 | 0.09 | -1.07 | 0.04 | 1.1 |
| 90.83567415730336 | 0.09 | -0.96 | 0.01 | 0.99 |
| 91.00245786516854 | 0.09 | -0.86 | -0.02 | 0.88 |
| 91.1692415730337 | 0.08 | -0.77 | -0.04 | 0.8 |
| 91.33602528089888 | 0.04 | -0.7 | -0.07 | 0.73 |
| 91.50280898876404 | 0.01 | -0.63 | -0.09 | 0.66 |
| 91.66959269662922 | -0.04 | -0.56 | -0.11 | 0.61 |
| 91.83637640449439 | -0.08 | -0.49 | -0.12 | 0.57 |
| 92.00316011235955 | -0.11 | -0.41 | -0.14 | 0.53 |
| 92.16994382022472 | -0.12 | -0.32 | -0.16 | 0.48 |
| 92.3367275280899 | -0.14 | -0.22 | -0.18 | 0.47 |
| 92.50351123595506 | -0.15 | -0.11 | -0.21 | 0.5 |
| 92.66151685393258 | -0.14 | -0.03 | -0.23 | 0.53 |
| 92.82830056179776 | -0.12 | 0.05 | -0.26 | 0.56 |
| 92.99508426966291 | -0.11 | 0.11 | -0.28 | 0.59 |
| 93.16186797752809 | -0.1 | 0.17 | -0.31 | 0.58 |
| 93.32865168539325 | -0.09 | 0.23 | -0.33 | 0.59 |
| 93.49543539325842 | -0.1 | 0.26 | -0.35 | 0.6 |
| 93.66221910112358 | -0.1 | 0.3 | -0.37 | 0.6 |
| 93.82900280898876 | -0.13 | 0.32 | -0.39 | 0.63 |
| 93.99578651685393 | -0.15 | 0.35 | -0.4 | 0.65 |
| 94.1625702247191 | -0.17 | 0.38 | -0.41 | 0.66 |
| 94.32935393258427 | -0.19 | 0.41 | -0.42 | 0.67 |
| 94.49613764044945 | -0.21 | 0.43 | -0.42 | 0.69 |
| 94.66292134831461 | -0.23 | 0.46 | -0.43 | 0.72 |
| 94.82970505617978 | -0.22 | 0.49 | -0.43 | 0.73 |
| 94.99648876404494 | -0.19 | 0.52 | -0.44 | 0.75 |
| 95.16327247191012 | -0.17 | 0.54 | -0.45 | 0.76 |
| 95.33005617977528 | -0.16 | 0.55 | -0.46 | 0.77 |
| 95.49683988764046 | -0.14 | 0.56 | -0.47 | 0.78 |
| 95.66362359550563 | -0.14 | 0.55 | -0.48 | 0.78 |
| 95.83040730337078 | -0.15 | 0.52 | -0.49 | 0.77 |
| 95.99719101123594 | -0.16 | 0.5 | -0.49 | 0.76 |
| 96.16397471910112 | -0.19 | 0.47 | -0.49 | 0.74 |
| 96.33075842696628 | -0.21 | 0.44 | -0.49 | 0.73 |
| 96.49754213483145 | -0.21 | 0.43 | -0.49 | 0.72 |
| 96.66432584269663 | -0.2 | 0.43 | -0.49 | 0.71 |
| 96.8311095505618 | -0.19 | 0.42 | -0.49 | 0.7 |
| 96.99789325842697 | -0.18 | 0.41 | -0.49 | 0.7 |
| 97.16467696629213 | -0.17 | 0.41 | -0.5 | 0.69 |
| 97.3314606741573 | -0.18 | 0.39 | -0.5 | 0.69 |
| 97.49824438202248 | -0.17 | 0.39 | -0.5 | 0.68 |
| 97.66502808988764 | -0.17 | 0.38 | -0.5 | 0.68 |
| 97.8318117977528 | -0.17 | 0.36 | -0.49 | 0.66 |
| 97.99859550561798 | -0.16 | 0.36 | -0.49 | 0.65 |
| 98.16537921348316 | -0.17 | 0.35 | -0.48 | 0.65 |
| 98.33216292134833 | -0.17 | 0.35 | -0.47 | 0.64 |
| 98.49894662921349 | -0.16 | 0.35 | -0.47 | 0.63 |
| 98.66573033707866 | -0.18 | 0.34 | -0.46 | 0.63 |
| 98.8325140449438 | -0.19 | 0.34 | -0.45 | 0.63 |
| 98.99929775280897 | -0.21 | 0.34 | -0.44 | 0.63 |
| 99.16608146067416 | -0.21 | 0.36 | -0.43 | 0.63 |
| 99.33286516853933 | -0.22 | 0.37 | -0.42 | 0.63 |
| 99.49964887640449 | -0.22 | 0.38 | -0.41 | 0.63 |
| 99.66643258426966 | -0.21 | 0.38 | -0.41 | 0.62 |
| 99.83321629213484 | -0.2 | 0.37 | -0.39 | 0.61 |
| 100.0 | -0.2 | 0.38 | -0.39 | 0.61 |